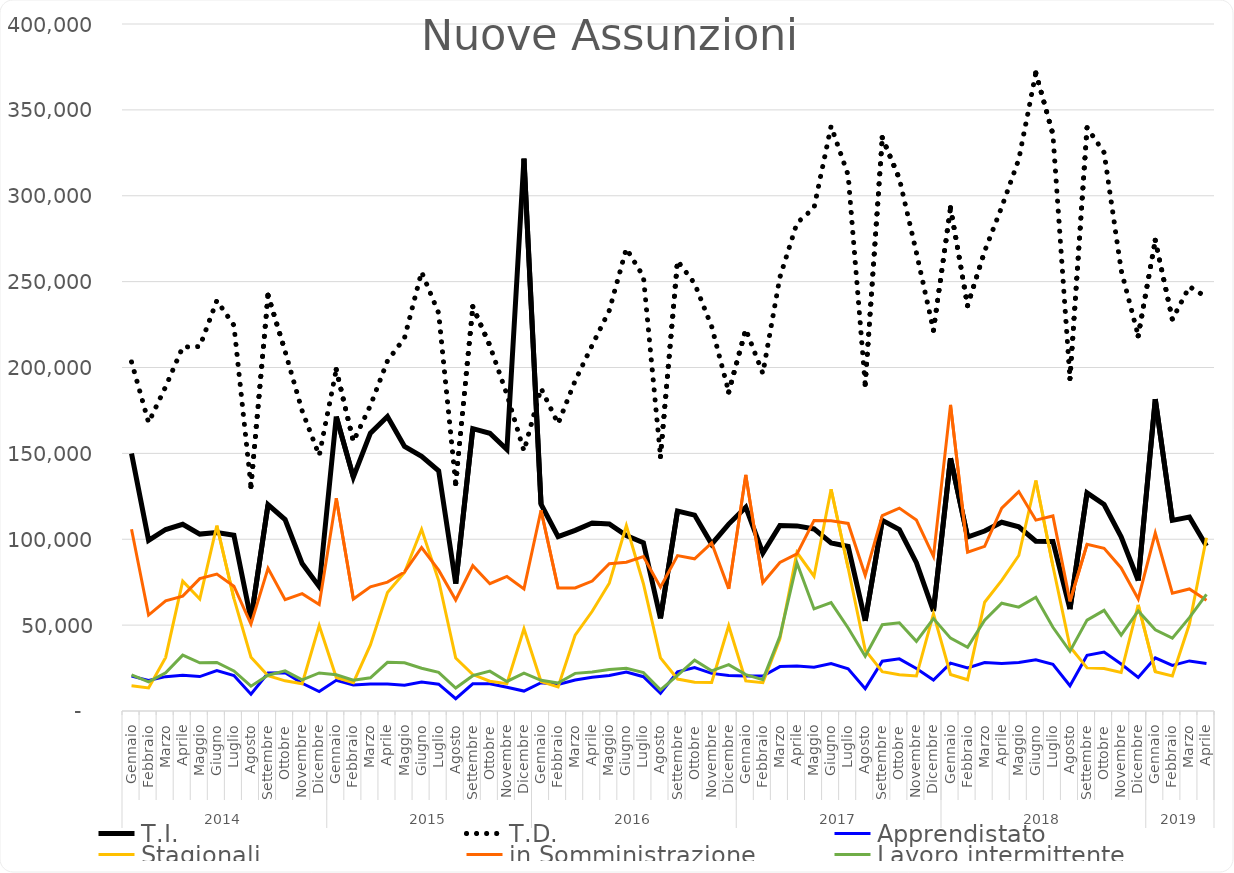
| Category | T.I. | T.D. | Apprendistato | Stagionali | in Somministrazione | Lavoro intermittente |
|---|---|---|---|---|---|---|
| 0 | 149951 | 203248 | 20280 | 14705 | 105866 | 20990 |
| 1 | 99368 | 167928 | 17721 | 13434 | 55878 | 16977 |
| 2 | 105671 | 188845 | 20009 | 31193 | 64186 | 22298 |
| 3 | 108723 | 211908 | 20876 | 75634 | 66905 | 32515 |
| 4 | 103010 | 212198 | 20048 | 65170 | 77067 | 28086 |
| 5 | 103916 | 238981 | 23514 | 107890 | 79683 | 28261 |
| 6 | 102353 | 224605 | 20682 | 65600 | 72672 | 23324 |
| 7 | 53286 | 130707 | 9744 | 31300 | 50602 | 14464 |
| 8 | 120205 | 242121 | 22153 | 20515 | 83093 | 20807 |
| 9 | 111455 | 209450 | 22258 | 17567 | 64760 | 23389 |
| 10 | 85823 | 174766 | 16131 | 15859 | 68301 | 18116 |
| 11 | 72408 | 148754 | 11359 | 49805 | 62007 | 22158 |
| 12 | 171431 | 198775 | 17845 | 19476 | 123860 | 21126 |
| 13 | 136182 | 156934 | 15143 | 16458 | 65159 | 17885 |
| 14 | 161813 | 177851 | 15680 | 38475 | 72309 | 19350 |
| 15 | 171450 | 203833 | 15717 | 69025 | 75059 | 28365 |
| 16 | 153996 | 217260 | 15046 | 80646 | 80974 | 28057 |
| 17 | 148319 | 255660 | 16906 | 105780 | 95206 | 24901 |
| 18 | 139897 | 231655 | 15602 | 75956 | 82001 | 22528 |
| 19 | 74174 | 132417 | 7145 | 30817 | 64637 | 13368 |
| 20 | 164378 | 235449 | 15842 | 21229 | 84594 | 20575 |
| 21 | 161713 | 212745 | 15916 | 17311 | 74092 | 23189 |
| 22 | 152211 | 184281 | 13860 | 15926 | 78355 | 17206 |
| 23 | 321583 | 151373 | 11617 | 47855 | 71094 | 22047 |
| 24 | 120402 | 187899 | 16458 | 17136 | 116865 | 17879 |
| 25 | 101557 | 167268 | 15428 | 14045 | 71554 | 16305 |
| 26 | 105165 | 192326 | 18087 | 44177 | 71651 | 21910 |
| 27 | 109512 | 212996 | 19707 | 58057 | 75638 | 22681 |
| 28 | 108930 | 233220 | 20626 | 74399 | 85739 | 24219 |
| 29 | 102146 | 269268 | 22714 | 108017 | 86615 | 24850 |
| 30 | 97940 | 252934 | 19966 | 74107 | 89940 | 22320 |
| 31 | 53914 | 148196 | 10292 | 30914 | 72134 | 12304 |
| 32 | 116468 | 262128 | 22783 | 18614 | 90496 | 20794 |
| 33 | 114076 | 248940 | 25339 | 16800 | 88596 | 29586 |
| 34 | 97177 | 223845 | 21895 | 16654 | 97825 | 23381 |
| 35 | 108826 | 185746 | 20687 | 49669 | 71095 | 26995 |
| 36 | 118642 | 222212 | 20341 | 17511 | 137485 | 21163 |
| 37 | 91978 | 196546 | 20371 | 16461 | 74710 | 18294 |
| 38 | 108008 | 252548 | 25848 | 41949 | 86507 | 43461 |
| 39 | 107780 | 284104 | 26239 | 92254 | 91441 | 86160 |
| 40 | 106005 | 292998 | 25488 | 78457 | 110889 | 59443 |
| 41 | 97841 | 340529 | 27637 | 129144 | 110782 | 63089 |
| 42 | 95813 | 312005 | 24585 | 83240 | 109211 | 48356 |
| 43 | 52459 | 190176 | 13030 | 35425 | 79003 | 31896 |
| 44 | 110981 | 333856 | 28987 | 22898 | 113760 | 50264 |
| 45 | 105622 | 309928 | 30377 | 21062 | 118117 | 51385 |
| 46 | 86352 | 266854 | 24733 | 20364 | 111174 | 40539 |
| 47 | 58194 | 221675 | 18065 | 56502 | 90015 | 53815 |
| 48 | 147189 | 293016 | 27886 | 21253 | 178198 | 42422 |
| 49 | 101282 | 236024 | 25043 | 18175 | 92470 | 37073 |
| 50 | 104798 | 267752 | 28262 | 63303 | 95898 | 52877 |
| 51 | 109889 | 293419 | 27719 | 76072 | 118071 | 62748 |
| 52 | 107290 | 321202 | 28305 | 90537 | 127766 | 60488 |
| 53 | 98841 | 371508 | 29790 | 134198 | 111147 | 66251 |
| 54 | 98704 | 335774 | 27245 | 84462 | 113569 | 48738 |
| 55 | 59265 | 193603 | 14676 | 37385 | 63844 | 34763 |
| 56 | 126984 | 339699 | 32453 | 25108 | 97027 | 52895 |
| 57 | 120208 | 325149 | 34327 | 24758 | 94753 | 58601 |
| 58 | 101456 | 256682 | 27335 | 22391 | 83288 | 44184 |
| 59 | 75982 | 218441 | 19486 | 61745 | 65242 | 58295 |
| 60 | 181593 | 274056 | 30993 | 22883 | 103602 | 47255 |
| 61 | 111004 | 228030 | 26547 | 20381 | 68557 | 42390 |
| 62 | 112905 | 247093 | 29163 | 50636 | 71053 | 54349 |
| 63 | 96094 | 240993 | 27650 | 100901 | 64442 | 67856 |